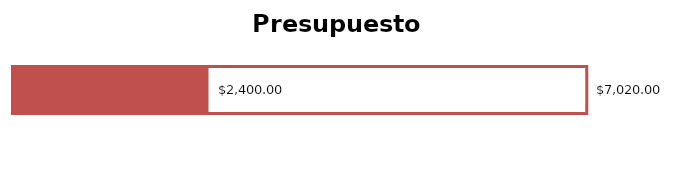
| Category | Total ingresos | Total de gastos |
|---|---|---|
| 0 | 7020 | 2400 |